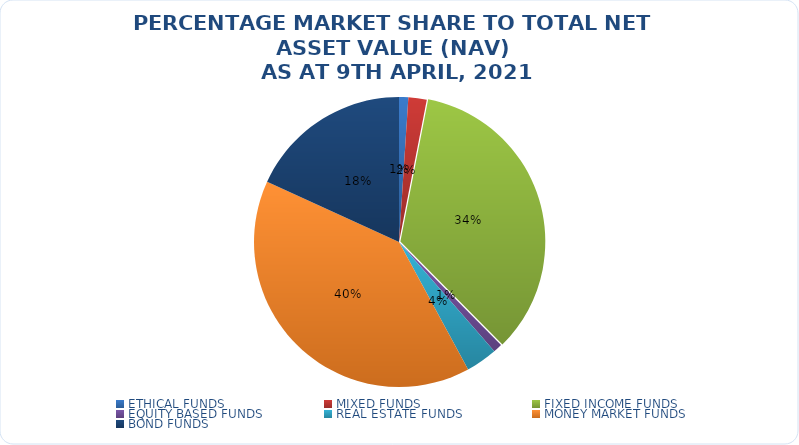
| Category | NET ASSET VALUE |
|---|---|
| ETHICAL FUNDS | 14729799044.21 |
| MIXED FUNDS | 29070858606.97 |
| FIXED INCOME FUNDS | 492164680304.934 |
| EQUITY BASED FUNDS | 14429392495.12 |
| REAL ESTATE FUNDS | 50017163271.771 |
| MONEY MARKET FUNDS | 566601011388.178 |
| BOND FUNDS | 259291107527.38 |